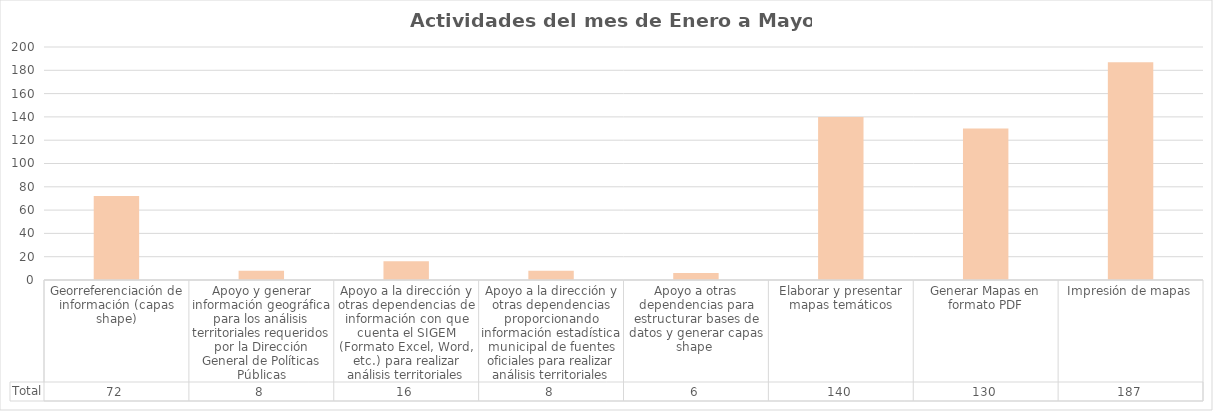
| Category | Total |
|---|---|
| Georreferenciación de información (capas shape) | 72 |
| Apoyo y generar información geográfica para los análisis territoriales requeridos por la Dirección General de Políticas Públicas | 8 |
| Apoyo a la dirección y otras dependencias de información con que cuenta el SIGEM (Formato Excel, Word, etc.) para realizar análisis territoriales | 16 |
| Apoyo a la dirección y otras dependencias proporcionando información estadística municipal de fuentes oficiales para realizar análisis territoriales | 8 |
| Apoyo a otras dependencias para estructurar bases de datos y generar capas shape  | 6 |
| Elaborar y presentar mapas temáticos | 140 |
| Generar Mapas en formato PDF | 130 |
| Impresión de mapas | 187 |